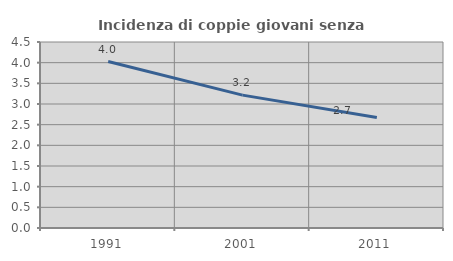
| Category | Incidenza di coppie giovani senza figli |
|---|---|
| 1991.0 | 4.028 |
| 2001.0 | 3.215 |
| 2011.0 | 2.671 |